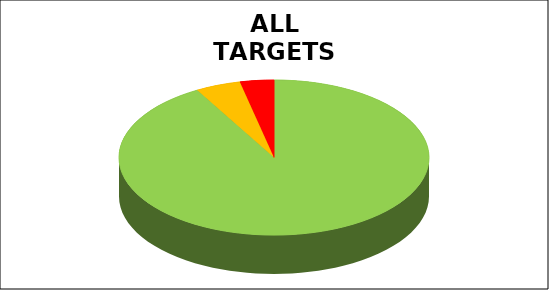
| Category | Series 0 |
|---|---|
| Green | 0.918 |
| Amber | 0.047 |
| Red | 0.035 |